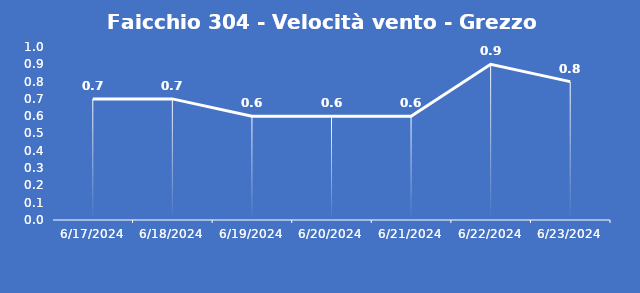
| Category | Faicchio 304 - Velocità vento - Grezzo (m/s) |
|---|---|
| 6/17/24 | 0.7 |
| 6/18/24 | 0.7 |
| 6/19/24 | 0.6 |
| 6/20/24 | 0.6 |
| 6/21/24 | 0.6 |
| 6/22/24 | 0.9 |
| 6/23/24 | 0.8 |